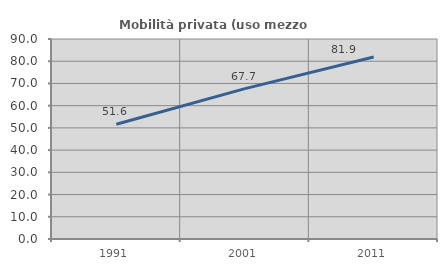
| Category | Mobilità privata (uso mezzo privato) |
|---|---|
| 1991.0 | 51.613 |
| 2001.0 | 67.677 |
| 2011.0 | 81.915 |